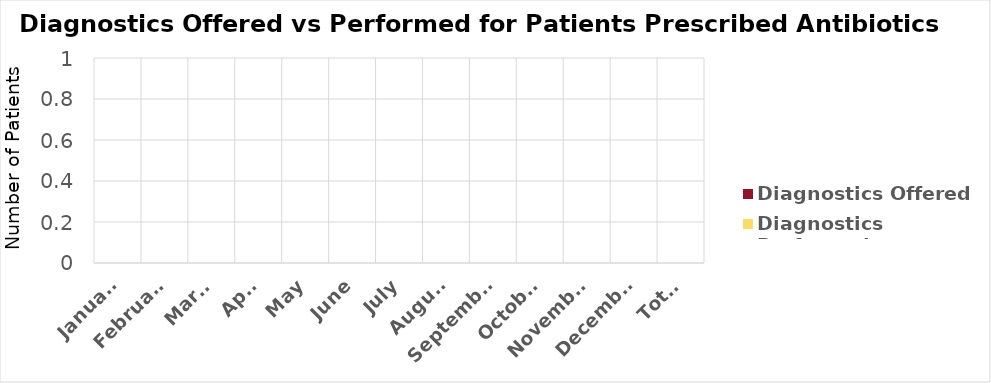
| Category | Diagnostics Offered | Diagnostics Performed |
|---|---|---|
| January | 0 | 0 |
| February | 0 | 0 |
| March | 0 | 0 |
| April | 0 | 0 |
| May | 0 | 0 |
| June | 0 | 0 |
| July | 0 | 0 |
| August | 0 | 0 |
| September | 0 | 0 |
| October | 0 | 0 |
| November | 0 | 0 |
| December | 0 | 0 |
| Total | 0 | 0 |